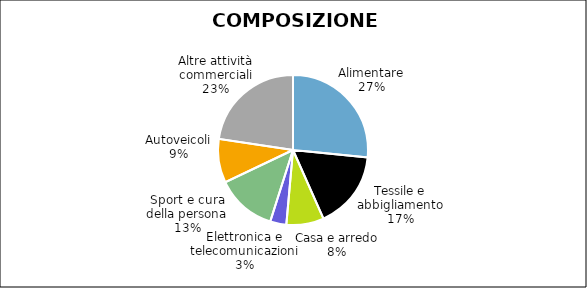
| Category | Series 0 |
|---|---|
| Alimentare | 2944 |
| Tessile e abbigliamento | 1855 |
| Casa e arredo | 893 |
| Elettronica e telecomunicazioni | 386 |
| Sport e cura
della persona | 1441 |
| Autoveicoli | 1046 |
| Altre attività commerciali | 2505 |